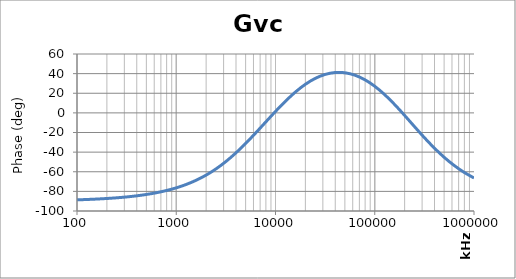
| Category | Gvc Phase |
|---|---|
| 100.0 | -88.63 |
| 125.89254117941677 | -88.275 |
| 158.48931924611153 | -87.829 |
| 199.52623149688802 | -87.267 |
| 251.18864315095806 | -86.559 |
| 316.22776601683825 | -85.67 |
| 398.1071705534976 | -84.551 |
| 501.1872336272727 | -83.145 |
| 630.9573444801932 | -81.38 |
| 794.3282347242821 | -79.168 |
| 1000.0 | -76.402 |
| 1258.925411794168 | -72.958 |
| 1584.8931924611156 | -68.693 |
| 1995.2623149688804 | -63.462 |
| 2511.886431509581 | -57.127 |
| 3162.2776601683804 | -49.6 |
| 3981.071705534977 | -40.877 |
| 5011.872336272732 | -31.085 |
| 6309.573444801938 | -20.491 |
| 7943.282347242815 | -9.486 |
| 10000.0 | 1.46 |
| 12589.254117941671 | 11.847 |
| 15848.931924611146 | 21.188 |
| 19952.623149688792 | 29.055 |
| 25118.86431509586 | 35.12 |
| 31622.77660168384 | 39.175 |
| 39810.71705534974 | 41.102 |
| 50118.723362727294 | 40.852 |
| 63095.73444801934 | 38.41 |
| 79432.82347242824 | 33.802 |
| 100000.0 | 27.126 |
| 125892.54117941685 | 18.59 |
| 158489.31924611164 | 8.551 |
| 199526.23149688813 | -2.494 |
| 251188.64315095844 | -13.954 |
| 316227.7660168382 | -25.232 |
| 398107.17055349716 | -35.809 |
| 501187.23362727347 | -45.323 |
| 630957.3444801942 | -53.587 |
| 794328.2347242833 | -60.571 |
| 1000000.0 | -66.355 |